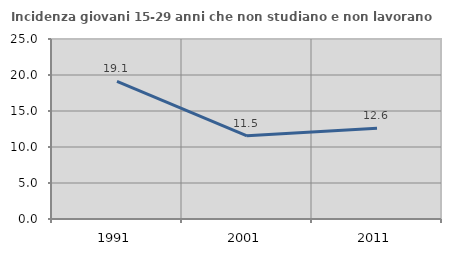
| Category | Incidenza giovani 15-29 anni che non studiano e non lavorano  |
|---|---|
| 1991.0 | 19.128 |
| 2001.0 | 11.548 |
| 2011.0 | 12.603 |